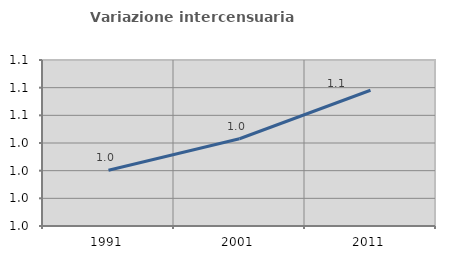
| Category | Variazione intercensuaria annua |
|---|---|
| 1991.0 | 1.02 |
| 2001.0 | 1.043 |
| 2011.0 | 1.078 |